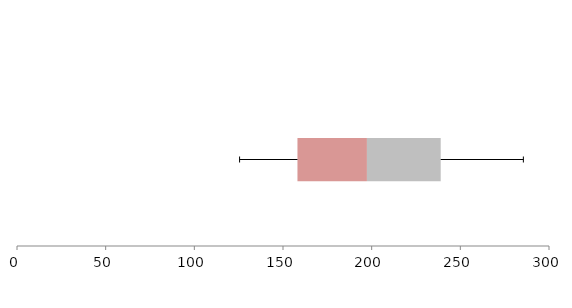
| Category | Series 1 | Series 2 | Series 3 |
|---|---|---|---|
| 0 | 158.155 | 39.175 | 41.599 |